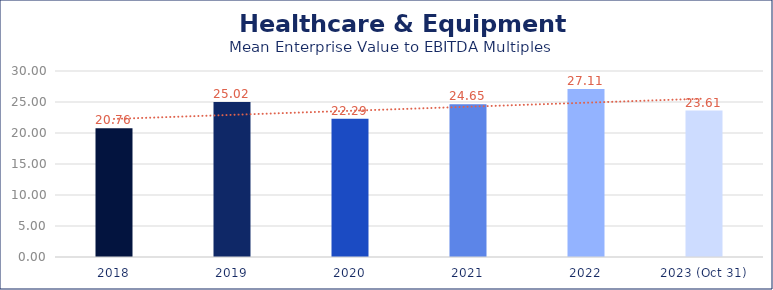
| Category | Healthcare & Equipment |
|---|---|
| 2018 | 20.76 |
| 2019 | 25.02 |
| 2020 | 22.29 |
| 2021 | 24.65 |
| 2022 | 27.11 |
| 2023 (Oct 31) | 23.61 |